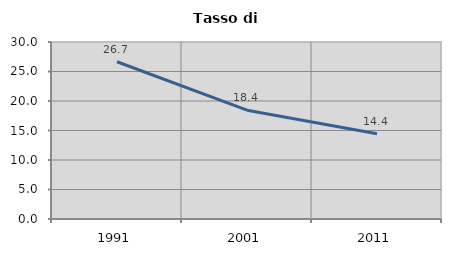
| Category | Tasso di disoccupazione   |
|---|---|
| 1991.0 | 26.654 |
| 2001.0 | 18.443 |
| 2011.0 | 14.444 |